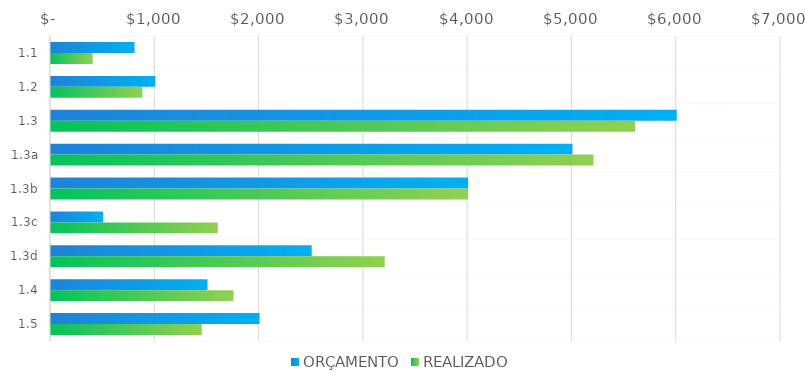
| Category | ORÇAMENTO | REALIZADO |
|---|---|---|
| 1.1 | 800 | 400 |
| 1.2 | 1000 | 875 |
| 1.3 | 6000 | 5600 |
| 1.3a | 5000 | 5200 |
| 1.3b | 4000 | 4000 |
| 1.3c | 500 | 1600 |
| 1.3d | 2500 | 3200 |
| 1.4 | 1500 | 1750 |
| 1.5 | 2000 | 1445 |